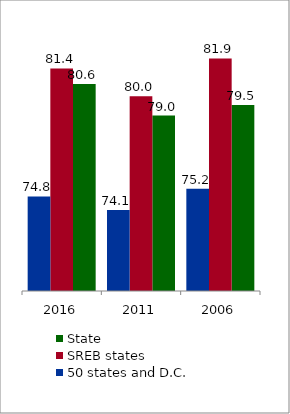
| Category | State | SREB states | 50 states and D.C. |
|---|---|---|---|
| 2006.0 | 79.498 | 81.884 | 75.221 |
| 2011.0 | 78.964 | 79.953 | 74.141 |
| 2016.0 | 80.572 | 81.371 | 74.83 |